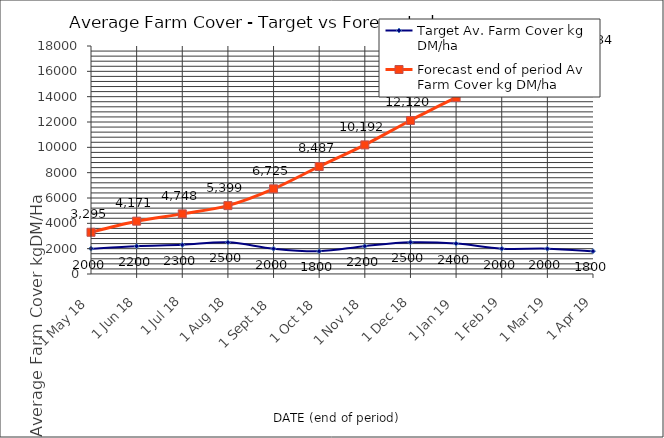
| Category | Target Av. Farm Cover kg DM/ha | Forecast end of period Av Farm Cover kg DM/ha |
|---|---|---|
| 1 May 18 | 2000 | 3295 |
| 1 Jun 18 | 2200 | 4170.75 |
| 1 Jul 18 | 2300 | 4748.25 |
| 1 Aug 18 | 2500 | 5399.25 |
| 1 Sep 18 | 2000 | 6724.5 |
| 1 Oct 18 | 1800 | 8487 |
| 1 Nov 18 | 2200 | 10192 |
| 1 Dec 18 | 2500 | 12119.5 |
| 1 Jan 19 | 2400 | 13933 |
| 1 Feb 19 | 2000 | 15366.75 |
| 1 Mar 19 | 2000 | 16157.75 |
| 1 Apr 19 | 1800 | 17033.5 |